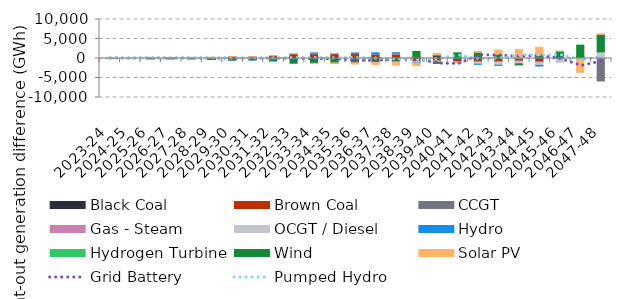
| Category | Black Coal | Brown Coal | CCGT | Gas - Steam | OCGT / Diesel | Hydro | Hydrogen Turbine | Wind | Solar PV |
|---|---|---|---|---|---|---|---|---|---|
| 2023-24 | 5.794 | 16.375 | -1.708 | -0.345 | -1.5 | -16.882 | 0 | -0.933 | 5.052 |
| 2024-25 | 8.359 | 0.845 | -1.229 | -5.001 | -3.169 | -3.555 | 0 | 4.851 | 4.259 |
| 2025-26 | 145.668 | -106.643 | -7.852 | -21.816 | -12.219 | 14.625 | 0 | 30.797 | 6.944 |
| 2026-27 | 186.704 | -144.118 | -4.284 | -15.148 | -14.574 | 7.034 | 0 | 0.919 | 17.741 |
| 2027-28 | 184.45 | -130.762 | -5.555 | -20.921 | -23.104 | 19.492 | 0 | 17.592 | 5.205 |
| 2028-29 | 251.677 | -131.223 | -12.715 | -32.45 | -31.586 | 3.556 | 0 | -61.38 | 54.955 |
| 2029-30 | -274.994 | 453.596 | -22.066 | -16.927 | -13.235 | -6.364 | 0 | -67.602 | 8.47 |
| 2030-31 | -93.924 | 444.254 | -89.315 | -26.391 | -18.222 | -92.226 | 0 | -67.792 | 7.691 |
| 2031-32 | -111.372 | 725.749 | -46.057 | -13.318 | -17.46 | -365.899 | 0 | -82.567 | 7.473 |
| 2032-33 | 542.854 | 629.167 | 26.889 | -33.478 | -13.22 | -43.076 | 0 | -1129.785 | 90.613 |
| 2033-34 | 487.165 | 615.323 | 182.107 | -7.831 | 59.545 | 83.354 | 0 | -1215.987 | -62.783 |
| 2034-35 | 483.928 | 685.721 | 119.341 | 0.975 | 70.216 | -36.831 | 0 | -1086.241 | -195.353 |
| 2035-36 | 425.271 | 761.033 | 118.84 | -10.813 | -7.935 | 114.49 | 0 | -1056.804 | -352.559 |
| 2036-37 | 252.485 | 827.847 | -15.569 | -4.643 | 31.618 | 355.84 | 0 | -983.668 | -521.825 |
| 2037-38 | 292.681 | 799.179 | 82.349 | -7.381 | 170.562 | 134.61 | 0 | -855.313 | -813.938 |
| 2038-39 | 297.703 | -723.328 | -63.573 | -59.192 | -320.714 | -89.888 | 0 | 1515.964 | -534.945 |
| 2039-40 | 671.518 | -603.618 | 172.999 | 0 | -325.103 | 149.561 | 0 | -315.596 | 319.385 |
| 2040-41 | -136.202 | -701.342 | -29.681 | 0 | -207.845 | 124.806 | 0 | 1334.198 | -70.095 |
| 2041-42 | 1.223 | -706.731 | -187.828 | 0 | -574.374 | -17.518 | 0 | 1584.07 | 180.8 |
| 2042-43 | -75.449 | -652.339 | -167.898 | 0 | -820.425 | -32.242 | 0 | 1055.785 | 1098.467 |
| 2043-44 | 18.264 | -647.099 | -34.6 | 0 | -688.474 | 77.357 | 0 | -266.636 | 2164.411 |
| 2044-45 | 73.779 | -907.194 | 24.137 | 0 | -862.166 | -169.594 | 0 | 645.92 | 2131.812 |
| 2045-46 | 30.139 | 52.319 | -21.828 | 0 | -968.509 | 156.464 | 0 | 1599.397 | 10.982 |
| 2046-47 | 232.581 | 85.737 | 9.369 | 0 | -390.716 | 134.485 | 0 | 2959.698 | -3175.125 |
| 2047-48 | 183.559 | 0 | -5759.566 | 0 | 1564.861 | 7.225 | 0 | 4410.655 | 151.068 |